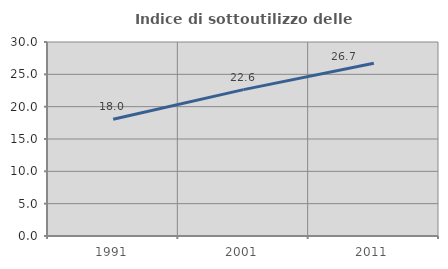
| Category | Indice di sottoutilizzo delle abitazioni  |
|---|---|
| 1991.0 | 18.046 |
| 2001.0 | 22.64 |
| 2011.0 | 26.715 |